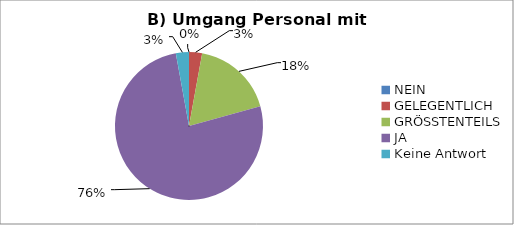
| Category | Series 0 |
|---|---|
| NEIN | 0 |
| GELEGENTLICH | 4 |
| GRÖSSTENTEILS | 25 |
| JA | 107 |
| Keine Antwort | 4 |